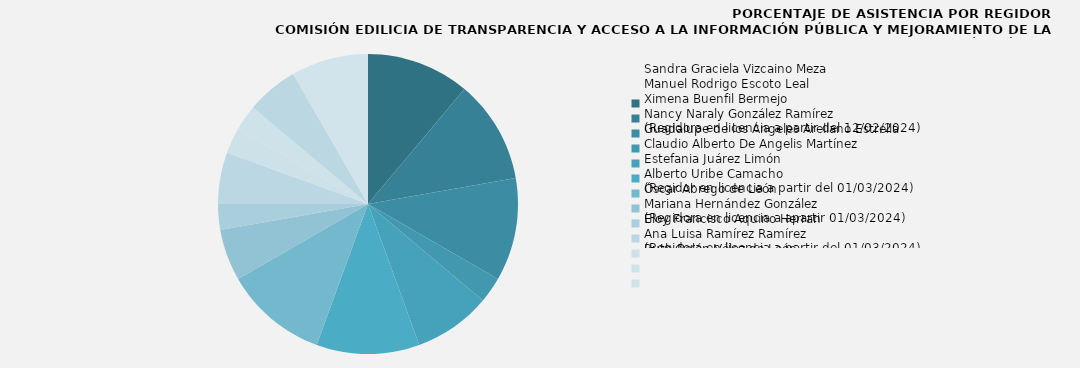
| Category | Sandra Graciela Vizcaino Meza |
|---|---|
| Sandra Graciela Vizcaino Meza | 100 |
| Manuel Rodrigo Escoto Leal | 100 |
| Ximena Buenfil Bermejo | 100 |
| Nancy Naraly González Ramírez
(Regidora en licencia a partir del 12/02/2024) | 25 |
| Guadalupe de los Ángeles Arellano Estrella | 75 |
| Claudio Alberto De Angelis Martínez | 100 |
| Estefania Juárez Limón | 100 |
| Alberto Uribe Camacho
(Regidor en licencia a partir del 01/03/2024) | 50 |
| Óscar Abrego de León | 25 |
| Mariana Hernández González
(Regidora en licencia a apartir 01/03/2024) | 50 |
| Eloy Francisco Aquino Herran | 25 |
| Ana Luisa Ramírez Ramírez
(Regidora en licencia a partir del 01/03/2024) | 25 |
| Ruth Belén Vélez de León | 0 |
| Dulce Sarahí Cortes Vite | 50 |
| Omar Antonio Borboa Becerra
(Regidor en licencia a partir del 16/02/2024) | 0 |
| Rocío Guadalupe Hidalgo Pérez | 75 |